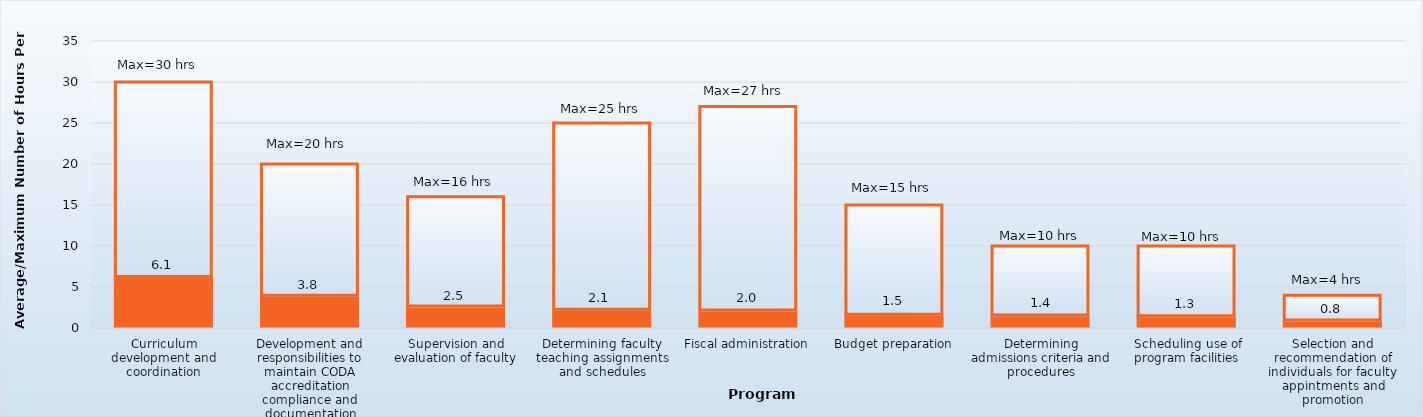
| Category | Average hours per week | Maximum |
|---|---|---|
| Curriculum development and coordination | 6.1 | 23.9 |
| Development and responsibilities to maintain CODA accreditation compliance and documentation | 3.8 | 16.2 |
| Supervision and evaluation of faculty | 2.5 | 13.5 |
| Determining faculty teaching assignments and schedules | 2.1 | 22.9 |
| Fiscal administration | 2 | 25 |
| Budget preparation | 1.5 | 13.5 |
| Determining admissions criteria and procedures | 1.4 | 8.6 |
| Scheduling use of program facilities | 1.3 | 8.7 |
| Selection and recommendation of individuals for faculty appintments and promotion | 0.8 | 3.2 |